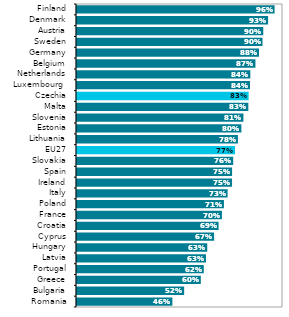
| Category | Series 1 |
|---|---|
| Romania | 0.463 |
| Bulgaria | 0.52 |
| Greece | 0.601 |
| Portugal | 0.615 |
| Latvia | 0.626 |
| Hungary | 0.632 |
| Cyprus | 0.666 |
| Croatia | 0.687 |
| France | 0.704 |
| Poland | 0.713 |
| Italy | 0.731 |
| Ireland | 0.753 |
| Spain | 0.753 |
| Slovakia | 0.758 |
| EU27 | 0.767 |
| Lithuania | 0.781 |
| Estonia | 0.798 |
| Slovenia | 0.808 |
| Malta | 0.832 |
| Czechia | 0.833 |
| Luxembourg  | 0.84 |
| Netherlands | 0.841 |
| Belgium | 0.866 |
| Germany | 0.883 |
| Sweden | 0.9 |
| Austria | 0.904 |
| Denmark | 0.928 |
| Finland | 0.959 |